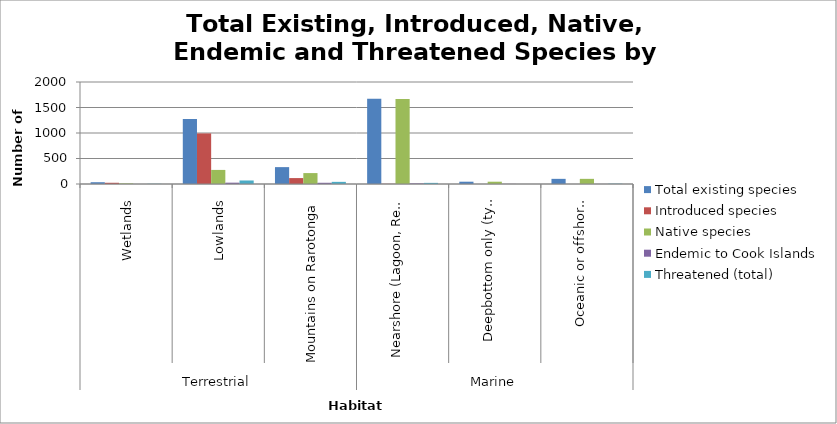
| Category | Total existing species | Introduced species | Native species | Endemic to Cook Islands | Threatened (total) |
|---|---|---|---|---|---|
| 0 | 35 | 24 | 11 | 0 | 4 |
| 1 | 1273 | 992 | 276 | 26 | 69 |
| 2 | 331 | 116 | 214 | 24 | 42 |
| 3 | 1671 | 3 | 1668 | 12 | 22 |
| 4 | 45 | 0 | 45 | 2 | 0 |
| 5 | 101 | 0 | 101 | 1 | 6 |